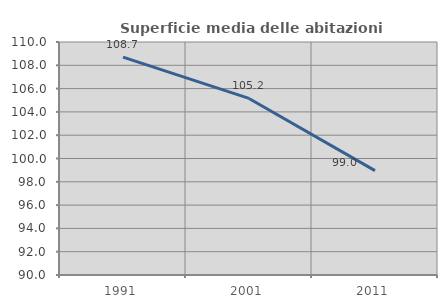
| Category | Superficie media delle abitazioni occupate |
|---|---|
| 1991.0 | 108.699 |
| 2001.0 | 105.156 |
| 2011.0 | 98.956 |